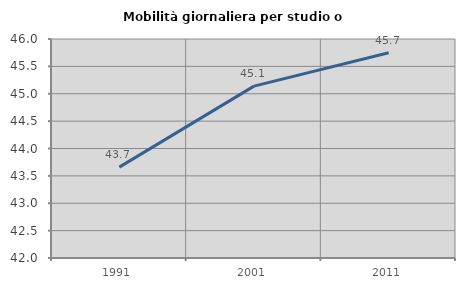
| Category | Mobilità giornaliera per studio o lavoro |
|---|---|
| 1991.0 | 43.66 |
| 2001.0 | 45.139 |
| 2011.0 | 45.749 |